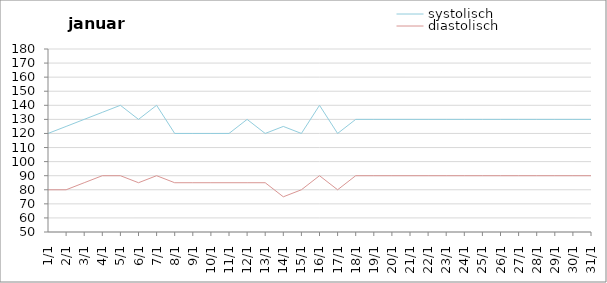
| Category | systolisch | diastolisch |
|---|---|---|
| 2011-01-01 | 120 | 80 |
| 2011-01-02 | 125 | 80 |
| 2011-01-03 | 130 | 85 |
| 2011-01-04 | 135 | 90 |
| 2011-01-05 | 140 | 90 |
| 2011-01-06 | 130 | 85 |
| 2011-01-07 | 140 | 90 |
| 2011-01-08 | 120 | 85 |
| 2011-01-09 | 120 | 85 |
| 2011-01-10 | 120 | 85 |
| 2011-01-11 | 120 | 85 |
| 2011-01-12 | 130 | 85 |
| 2011-01-13 | 120 | 85 |
| 2011-01-14 | 125 | 75 |
| 2011-01-15 | 120 | 80 |
| 2011-01-16 | 140 | 90 |
| 2011-01-17 | 120 | 80 |
| 2011-01-18 | 130 | 90 |
| 2011-01-19 | 130 | 90 |
| 2011-01-20 | 130 | 90 |
| 2011-01-21 | 130 | 90 |
| 2011-01-22 | 130 | 90 |
| 2011-01-23 | 130 | 90 |
| 2011-01-24 | 130 | 90 |
| 2011-01-25 | 130 | 90 |
| 2011-01-26 | 130 | 90 |
| 2011-01-27 | 130 | 90 |
| 2011-01-28 | 130 | 90 |
| 2011-01-29 | 130 | 90 |
| 2011-01-30 | 130 | 90 |
| 2011-01-31 | 130 | 90 |